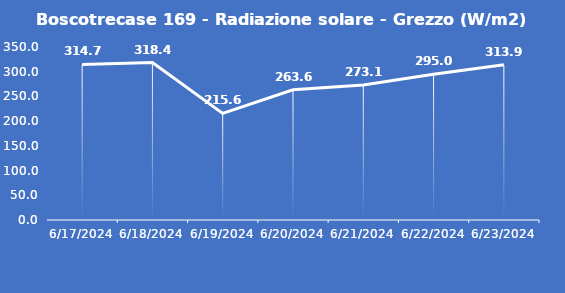
| Category | Boscotrecase 169 - Radiazione solare - Grezzo (W/m2) |
|---|---|
| 6/17/24 | 314.7 |
| 6/18/24 | 318.4 |
| 6/19/24 | 215.6 |
| 6/20/24 | 263.6 |
| 6/21/24 | 273.1 |
| 6/22/24 | 295 |
| 6/23/24 | 313.9 |